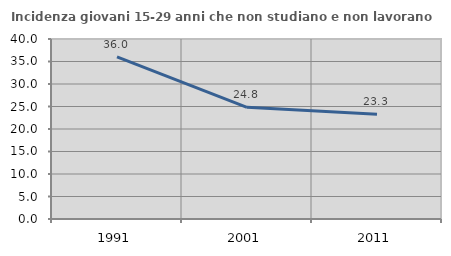
| Category | Incidenza giovani 15-29 anni che non studiano e non lavorano  |
|---|---|
| 1991.0 | 36.042 |
| 2001.0 | 24.818 |
| 2011.0 | 23.256 |